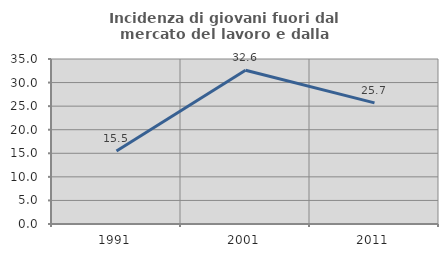
| Category | Incidenza di giovani fuori dal mercato del lavoro e dalla formazione  |
|---|---|
| 1991.0 | 15.464 |
| 2001.0 | 32.628 |
| 2011.0 | 25.689 |